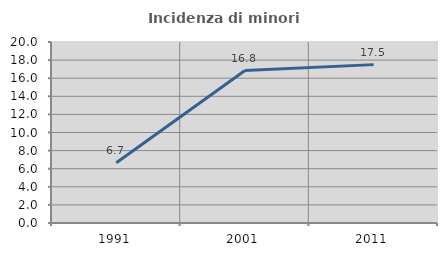
| Category | Incidenza di minori stranieri |
|---|---|
| 1991.0 | 6.667 |
| 2001.0 | 16.842 |
| 2011.0 | 17.5 |